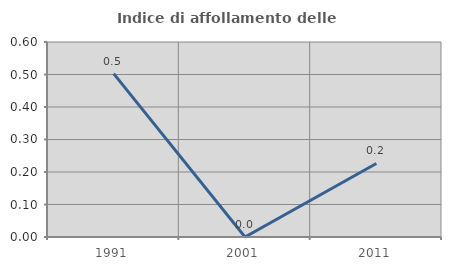
| Category | Indice di affollamento delle abitazioni  |
|---|---|
| 1991.0 | 0.503 |
| 2001.0 | 0 |
| 2011.0 | 0.226 |